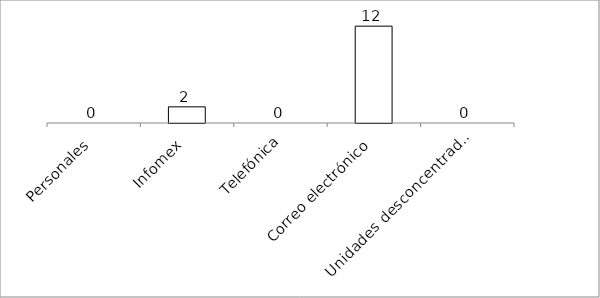
| Category | Series 0 |
|---|---|
| Personales | 0 |
| Infomex | 2 |
| Telefónica | 0 |
| Correo electrónico | 12 |
| Unidades desconcentradas | 0 |